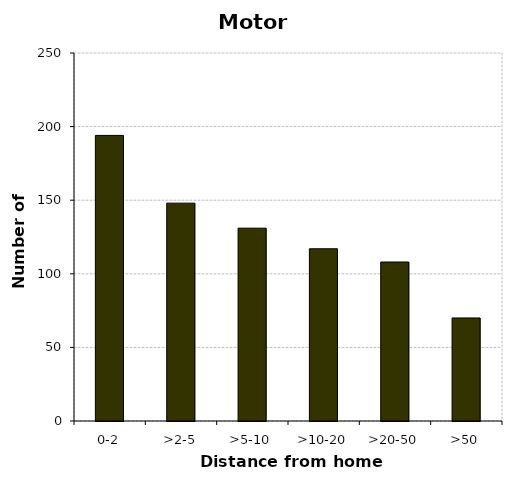
| Category | Motorcycles |
|---|---|
| 0-2 | 194 |
| >2-5 | 148 |
| >5-10 | 131 |
| >10-20 | 117 |
| >20-50 | 108 |
| >50 | 70 |